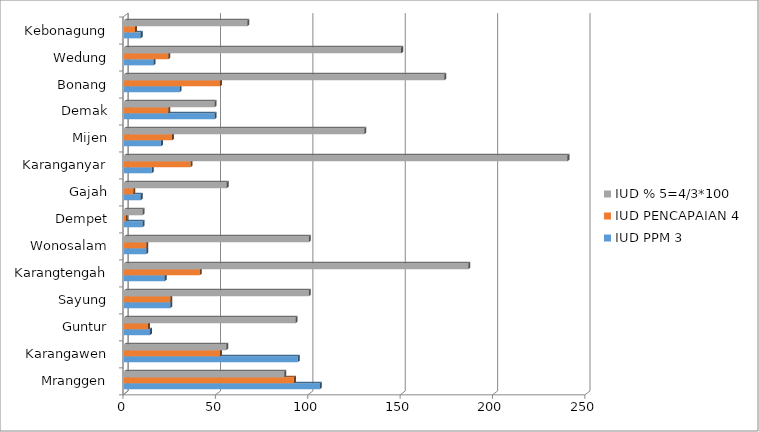
| Category | IUD |
|---|---|
| Mranggen | 86.792 |
| Karangawen | 55.319 |
| Guntur | 92.857 |
| Sayung | 100 |
| Karangtengah | 186.364 |
| Wonosalam | 100 |
| Dempet | 10 |
| Gajah | 55.556 |
| Karanganyar | 240 |
| Mijen | 130 |
| Demak | 48.98 |
| Bonang | 173.333 |
| Wedung | 150 |
| Kebonagung | 66.667 |